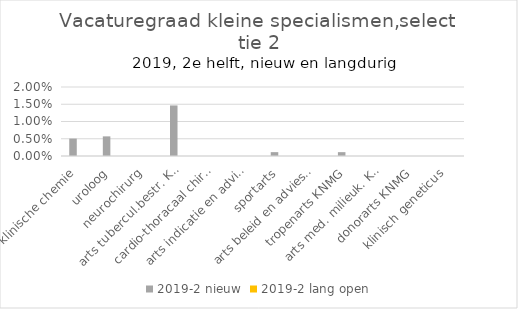
| Category | 2019-2 |
|---|---|
| arts klinische chemie | 0 |
| uroloog | 0 |
| neurochirurg | 0 |
| arts tubercul.bestr. KNMG | 0 |
| cardio-thoracaal chirurg | 0 |
| arts indicatie en advies KNMG | 0 |
| sportarts | 0 |
| arts beleid en advies KNMG | 0 |
| tropenarts KNMG | 0 |
| arts med. milieuk. KNMG | 0 |
| donorarts KNMG | 0 |
| klinisch geneticus | 0 |